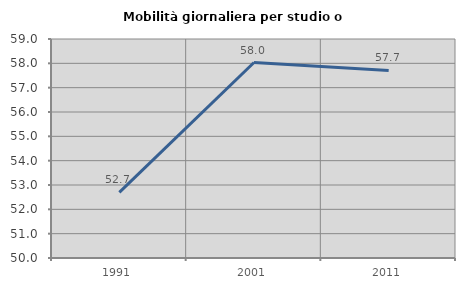
| Category | Mobilità giornaliera per studio o lavoro |
|---|---|
| 1991.0 | 52.7 |
| 2001.0 | 58.034 |
| 2011.0 | 57.71 |